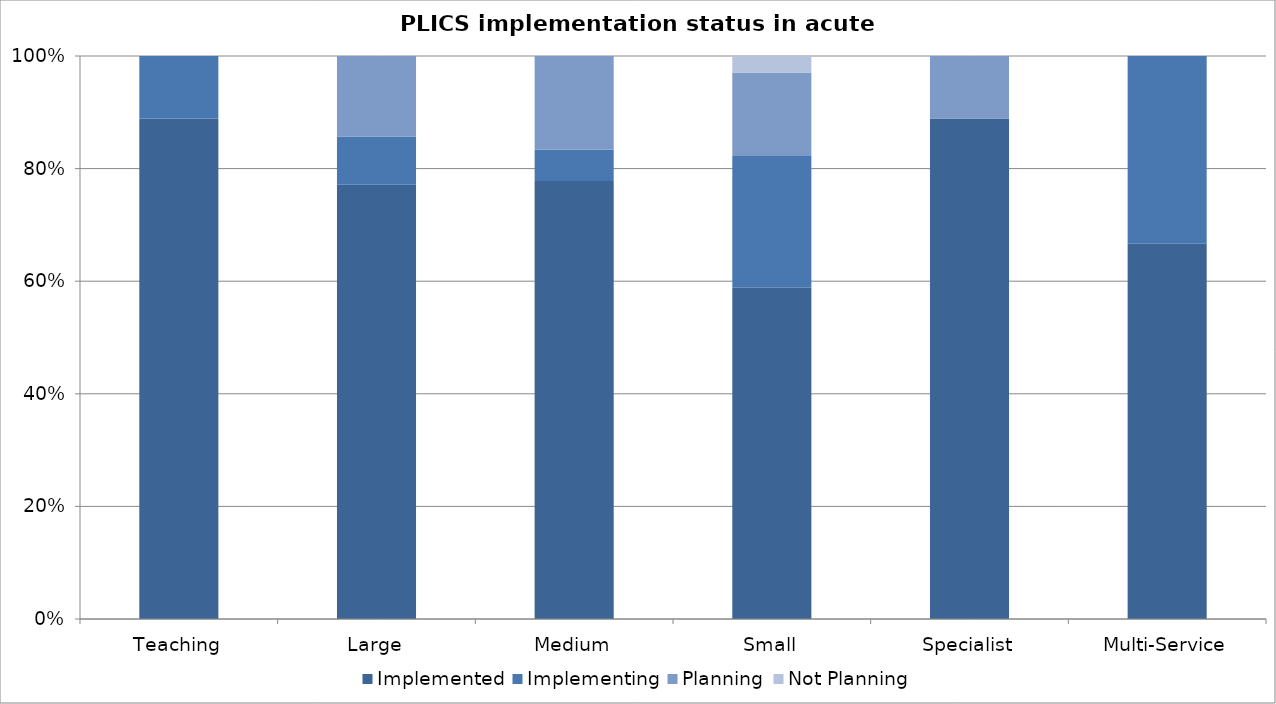
| Category | Implemented | Implementing | Planning | Not Planning |
|---|---|---|---|---|
| Teaching | 24 | 3 | 0 | 0 |
| Large | 27 | 3 | 5 | 0 |
| Medium | 28 | 2 | 6 | 0 |
| Small | 20 | 8 | 5 | 1 |
| Specialist | 16 | 0 | 2 | 0 |
| Multi-Service | 2 | 1 | 0 | 0 |